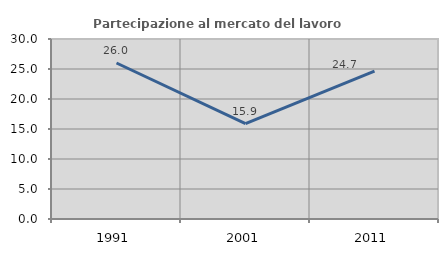
| Category | Partecipazione al mercato del lavoro  femminile |
|---|---|
| 1991.0 | 25.998 |
| 2001.0 | 15.886 |
| 2011.0 | 24.659 |